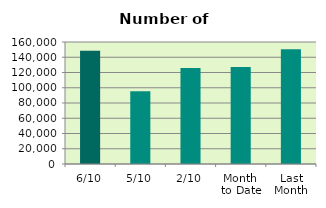
| Category | Series 0 |
|---|---|
| 6/10 | 148574 |
| 5/10 | 95462 |
| 2/10 | 126062 |
| Month 
to Date | 127357 |
| Last
Month | 150562.364 |